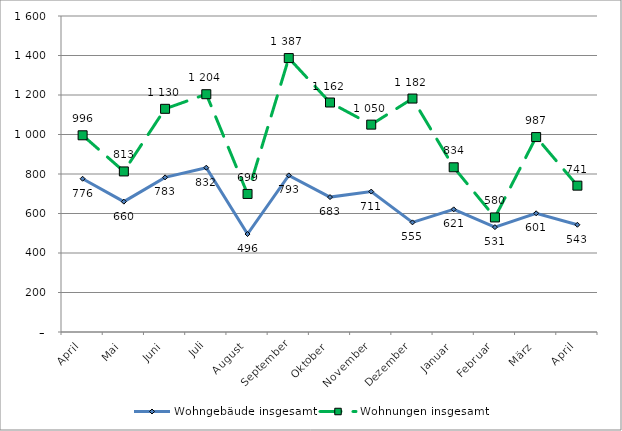
| Category | Wohngebäude insgesamt | Wohnungen insgesamt |
|---|---|---|
| April | 776 | 996 |
| Mai | 660 | 813 |
| Juni | 783 | 1130 |
| Juli | 832 | 1204 |
| August | 496 | 699 |
| September | 793 | 1387 |
| Oktober | 683 | 1162 |
| November | 711 | 1050 |
| Dezember | 555 | 1182 |
| Januar | 621 | 834 |
| Februar | 531 | 580 |
| März | 601 | 987 |
| April | 543 | 741 |